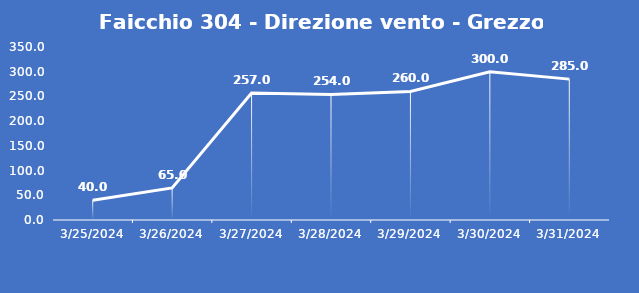
| Category | Faicchio 304 - Direzione vento - Grezzo (°N) |
|---|---|
| 3/25/24 | 40 |
| 3/26/24 | 65 |
| 3/27/24 | 257 |
| 3/28/24 | 254 |
| 3/29/24 | 260 |
| 3/30/24 | 300 |
| 3/31/24 | 285 |